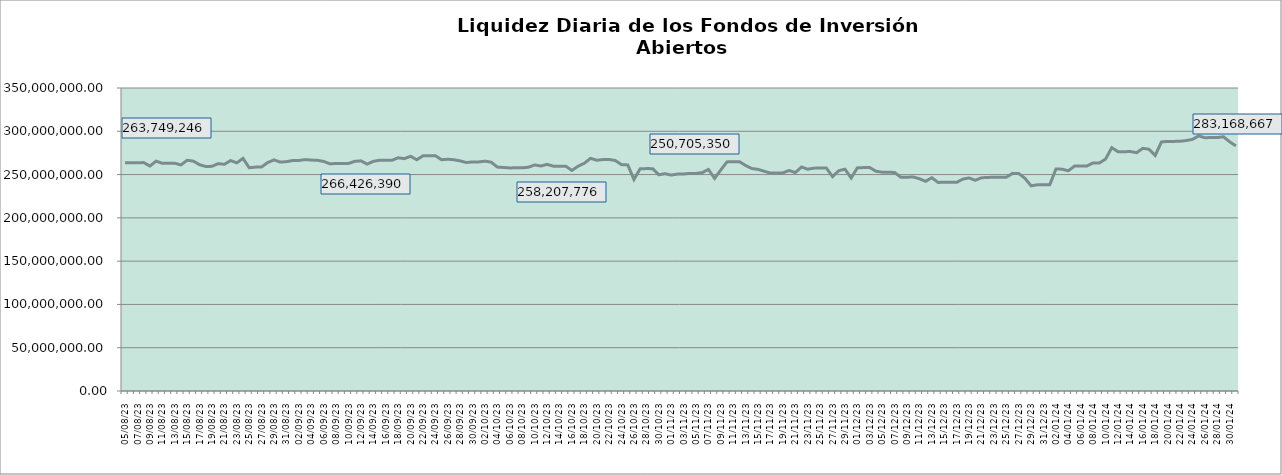
| Category | Series 0 |
|---|---|
| 2023-08-05 | 263749246.174 |
| 2023-08-06 | 263712619.506 |
| 2023-08-07 | 263704600.887 |
| 2023-08-08 | 263833387.014 |
| 2023-08-09 | 259858543.738 |
| 2023-08-10 | 265555660.497 |
| 2023-08-11 | 262959114.776 |
| 2023-08-12 | 263179971.407 |
| 2023-08-13 | 263142735.948 |
| 2023-08-14 | 261122221.37 |
| 2023-08-15 | 266531216.703 |
| 2023-08-16 | 265530561.031 |
| 2023-08-17 | 261396353.017 |
| 2023-08-18 | 259323800.907 |
| 2023-08-19 | 259514891.704 |
| 2023-08-20 | 262645036.646 |
| 2023-08-21 | 261815278.444 |
| 2023-08-22 | 266207935.491 |
| 2023-08-23 | 263530461.923 |
| 2023-08-24 | 268706637.239 |
| 2023-08-25 | 257891401.236 |
| 2023-08-26 | 258598271.337 |
| 2023-08-27 | 258795703.951 |
| 2023-08-28 | 264011713.95 |
| 2023-08-29 | 266931427.635 |
| 2023-08-30 | 264372798.47 |
| 2023-08-31 | 264914762.286 |
| 2023-09-01 | 266217427.318 |
| 2023-09-02 | 266250910.229 |
| 2023-09-03 | 267271901.555 |
| 2023-09-04 | 266782761.459 |
| 2023-09-05 | 266426389.872 |
| 2023-09-06 | 265187568.244 |
| 2023-09-07 | 262413326.376 |
| 2023-09-08 | 262810132.737 |
| 2023-09-09 | 262824374.216 |
| 2023-09-10 | 262790365.716 |
| 2023-09-11 | 265242612.199 |
| 2023-09-12 | 265881680.04 |
| 2023-09-13 | 262086154.143 |
| 2023-09-14 | 265278124.787 |
| 2023-09-15 | 266533861.284 |
| 2023-09-16 | 266501881.879 |
| 2023-09-17 | 266467991.852 |
| 2023-09-18 | 269411268.692 |
| 2023-09-19 | 268389745.488 |
| 2023-09-20 | 271114212.576 |
| 2023-09-21 | 267147299.882 |
| 2023-09-22 | 271645776.462 |
| 2023-09-23 | 271744565.8 |
| 2023-09-24 | 271766345.439 |
| 2023-09-25 | 267166669.547 |
| 2023-09-26 | 267718806.715 |
| 2023-09-27 | 267117674.204 |
| 2023-09-28 | 265795578.286 |
| 2023-09-29 | 263895109.972 |
| 2023-09-30 | 264638516.311 |
| 2023-10-01 | 264603921.817 |
| 2023-10-02 | 265532048.924 |
| 2023-10-03 | 264256395.489 |
| 2023-10-04 | 258628550.354 |
| 2023-10-05 | 258207776.455 |
| 2023-10-06 | 257679307.827 |
| 2023-10-07 | 257834942.459 |
| 2023-10-08 | 257799680.549 |
| 2023-10-09 | 258532173.752 |
| 2023-10-10 | 261076677.677 |
| 2023-10-11 | 259889154.795 |
| 2023-10-12 | 261778127.868 |
| 2023-10-13 | 259720344.655 |
| 2023-10-14 | 259679087.828 |
| 2023-10-15 | 259750454.835 |
| 2023-10-16 | 254812909.545 |
| 2023-10-17 | 259675401.553 |
| 2023-10-18 | 263053472.621 |
| 2023-10-19 | 268776144.816 |
| 2023-10-20 | 266546808.403 |
| 2023-10-21 | 267344622.355 |
| 2023-10-22 | 267390063.246 |
| 2023-10-23 | 266258939.419 |
| 2023-10-24 | 261481359.299 |
| 2023-10-25 | 261139993.155 |
| 2023-10-26 | 244293349.604 |
| 2023-10-27 | 256727443.123 |
| 2023-10-28 | 256884431.017 |
| 2023-10-29 | 256850109.491 |
| 2023-10-30 | 249766187.966 |
| 2023-10-31 | 251022744.113 |
| 2023-11-01 | 249394351.302 |
| 2023-11-02 | 250518088.57 |
| 2023-11-03 | 250705350.056 |
| 2023-11-04 | 251307514.14 |
| 2023-11-05 | 251311936.2 |
| 2023-11-06 | 252311247.399 |
| 2023-11-07 | 255841048.888 |
| 2023-11-08 | 245570473.648 |
| 2023-11-09 | 255417171.21 |
| 2023-11-10 | 264658073.07 |
| 2023-11-11 | 264833784.293 |
| 2023-11-12 | 264939566.478 |
| 2023-11-13 | 260465912.545 |
| 2023-11-14 | 256959389.154 |
| 2023-11-15 | 255996781.043 |
| 2023-11-16 | 253804762.534 |
| 2023-11-17 | 251734979.495 |
| 2023-11-18 | 251792784.059 |
| 2023-11-19 | 251957806.861 |
| 2023-11-20 | 254741678.517 |
| 2023-11-21 | 252319314.13 |
| 2023-11-22 | 258725327.549 |
| 2023-11-23 | 256197321.606 |
| 2023-11-24 | 257438130.598 |
| 2023-11-25 | 257476322.205 |
| 2023-11-26 | 257566453.097 |
| 2023-11-27 | 247610211.606 |
| 2023-11-28 | 254442534.712 |
| 2023-11-29 | 256216369.701 |
| 2023-11-30 | 246009253.593 |
| 2023-12-01 | 257733333.156 |
| 2023-12-02 | 258061353.508 |
| 2023-12-03 | 258074156.137 |
| 2023-12-04 | 253847107.329 |
| 2023-12-05 | 252750726.324 |
| 2023-12-06 | 252734187.417 |
| 2023-12-07 | 252402453.655 |
| 2023-12-08 | 246925807.355 |
| 2023-12-09 | 246951256.42 |
| 2023-12-10 | 247279264.64 |
| 2023-12-11 | 245117562.788 |
| 2023-12-12 | 242225909.724 |
| 2023-12-13 | 246382469.537 |
| 2023-12-14 | 240944384.79 |
| 2023-12-15 | 241062768.005 |
| 2023-12-16 | 240990298.763 |
| 2023-12-17 | 240988387.794 |
| 2023-12-18 | 244788841.365 |
| 2023-12-19 | 246132194.923 |
| 2023-12-20 | 243398448.279 |
| 2023-12-21 | 246305942.456 |
| 2023-12-22 | 246715132.072 |
| 2023-12-23 | 246842715.196 |
| 2023-12-24 | 246808499.949 |
| 2023-12-25 | 246809454.91 |
| 2023-12-26 | 251395932.189 |
| 2023-12-27 | 251224396.974 |
| 2023-12-28 | 245770348.856 |
| 2023-12-29 | 236962941.362 |
| 2023-12-30 | 238175571.448 |
| 2023-12-31 | 238170606.114 |
| 2024-01-01 | 238161020.07 |
| 2024-01-02 | 256418826.387 |
| 2024-01-03 | 256239117.86 |
| 2024-01-04 | 254380857.341 |
| 2024-01-05 | 259860973.688 |
| 2024-01-06 | 260005507.671 |
| 2024-01-07 | 259994176.766 |
| 2024-01-08 | 263492352.425 |
| 2024-01-09 | 263434567.066 |
| 2024-01-10 | 267931316.05 |
| 2024-01-11 | 281077888.933 |
| 2024-01-12 | 276396340.282 |
| 2024-01-13 | 276421023.482 |
| 2024-01-14 | 276603540.47 |
| 2024-01-15 | 275278221.764 |
| 2024-01-16 | 280322977.03 |
| 2024-01-17 | 279245776.539 |
| 2024-01-18 | 272165626.177 |
| 2024-01-19 | 287701267.815 |
| 2024-01-20 | 288340553.177 |
| 2024-01-21 | 288307339.383 |
| 2024-01-22 | 288481419.914 |
| 2024-01-23 | 289311709.439 |
| 2024-01-24 | 290673963.649 |
| 2024-01-25 | 294645162.645 |
| 2024-01-26 | 292543532.888 |
| 2024-01-27 | 292813638.34 |
| 2024-01-28 | 292777857.047 |
| 2024-01-29 | 293691467.043 |
| 2024-01-30 | 287778394.466 |
| 2024-01-31 | 283168667.421 |